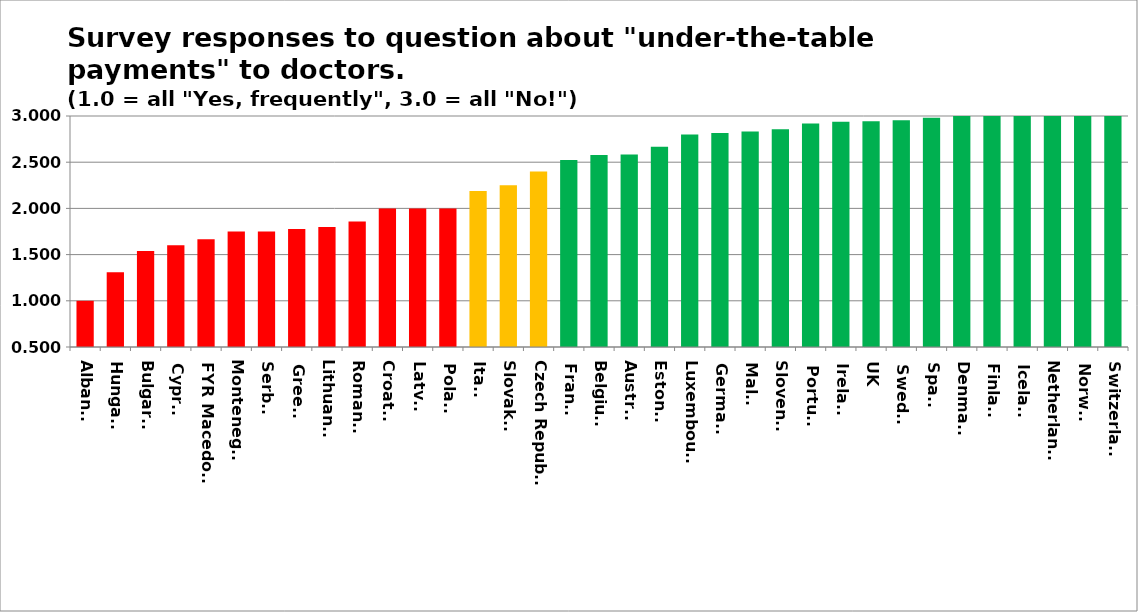
| Category | Series 0 |
|---|---|
| Albania | 1 |
| Hungary | 1.308 |
| Bulgaria | 1.538 |
| Cyprus | 1.6 |
| FYR Macedonia | 1.667 |
| Montenegro | 1.75 |
| Serbia | 1.75 |
| Greece | 1.778 |
| Lithuania | 1.8 |
| Romania | 1.857 |
| Croatia | 2 |
| Latvia | 2 |
| Poland | 2 |
| Italy | 2.188 |
| Slovakia | 2.25 |
| Czech Republic | 2.4 |
| France | 2.525 |
| Belgium | 2.577 |
| Austria | 2.583 |
| Estonia | 2.667 |
| Luxembourg | 2.8 |
| Germany | 2.815 |
| Malta | 2.833 |
| Slovenia | 2.857 |
| Portugal | 2.92 |
| Ireland | 2.938 |
| UK | 2.944 |
| Sweden | 2.953 |
| Spain | 2.982 |
| Denmark | 3 |
| Finland | 3 |
| Iceland | 3 |
| Netherlands | 3 |
| Norway | 3 |
| Switzerland | 3 |